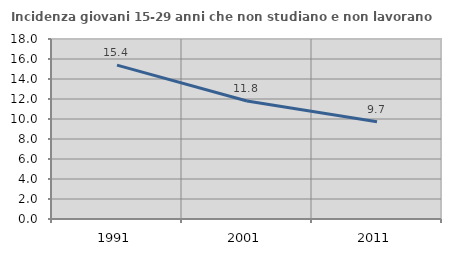
| Category | Incidenza giovani 15-29 anni che non studiano e non lavorano  |
|---|---|
| 1991.0 | 15.385 |
| 2001.0 | 11.798 |
| 2011.0 | 9.716 |